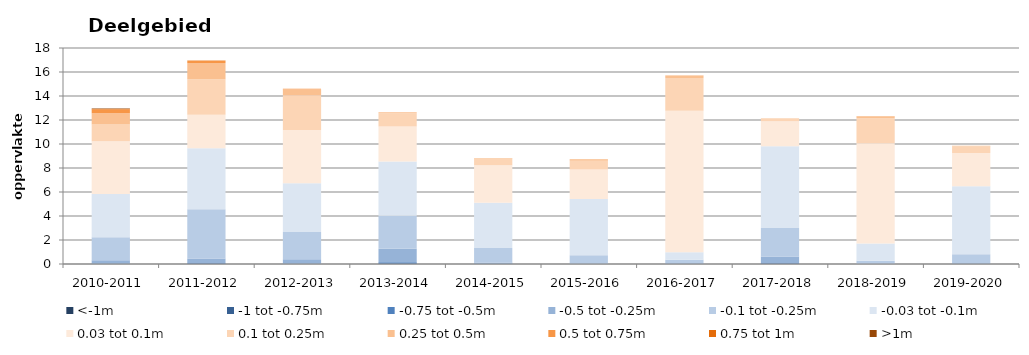
| Category | <-1m | -1 tot -0.75m | -0.75 tot -0.5m | -0.5 tot -0.25m | -0.1 tot -0.25m | -0.03 tot -0.1m | 0.03 tot 0.1m | 0.1 tot 0.25m | 0.25 tot 0.5m | 0.5 tot 0.75m | 0.75 tot 1m | >1m |
|---|---|---|---|---|---|---|---|---|---|---|---|---|
| 2010-2011 | 0 | 0.001 | 0.012 | 0.296 | 1.912 | 3.621 | 4.395 | 1.391 | 0.944 | 0.301 | 0.054 | 0.022 |
| 2011-2012 | 0.002 | 0.006 | 0.052 | 0.398 | 4.112 | 5.074 | 2.787 | 2.954 | 1.364 | 0.178 | 0.022 | 0.012 |
| 2012-2013 | 0.001 | 0.003 | 0.022 | 0.364 | 2.27 | 4.069 | 4.446 | 2.878 | 0.514 | 0.029 | 0.006 | 0.002 |
| 2013-2014 | 0.002 | 0.018 | 0.136 | 1.108 | 2.75 | 4.528 | 2.918 | 1.108 | 0.079 | 0.004 | 0 | 0 |
| 2014-2015 | 0 | 0 | 0.013 | 0.109 | 1.211 | 3.766 | 3.138 | 0.552 | 0.039 | 0.004 | 0 | 0 |
| 2015-2016 | 0 | 0 | 0.002 | 0.048 | 0.689 | 4.68 | 2.448 | 0.744 | 0.103 | 0.007 | 0.002 | 0.001 |
| 2016-2017 | 0.001 | 0.002 | 0.003 | 0.059 | 0.283 | 0.629 | 11.792 | 2.74 | 0.181 | 0.012 | 0.004 | 0.001 |
| 2017-2018 | 0.002 | 0.007 | 0.048 | 0.576 | 2.371 | 6.806 | 2.084 | 0.233 | 0.02 | 0.002 | 0 | 0 |
| 2018-2019 | 0 | 0 | 0.001 | 0.011 | 0.262 | 1.44 | 8.34 | 2.099 | 0.144 | 0.009 | 0.003 | 0.003 |
| 2019-2020 | 0.002 | 0.001 | 0.005 | 0.054 | 0.755 | 5.655 | 2.773 | 0.574 | 0.033 | 0.002 | 0.001 | 0 |